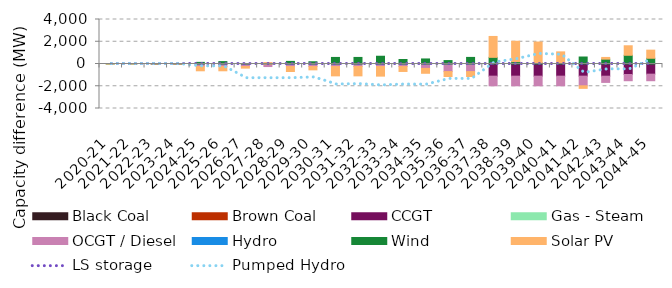
| Category | Black Coal | Brown Coal | CCGT | Gas - Steam | OCGT / Diesel | Hydro | Wind | Solar PV |
|---|---|---|---|---|---|---|---|---|
| 2020-21 | 0 | 0 | 0 | 0 | 0 | 0 | 0.007 | 0.002 |
| 2021-22 | 0 | 0 | 0 | 0 | 0 | 0 | 0.007 | 0.002 |
| 2022-23 | 0 | 0 | 0 | 0 | 0.001 | 0 | 0.007 | 0.002 |
| 2023-24 | 0 | 0 | 0 | 0 | -0.001 | 0 | 0.415 | 0.005 |
| 2024-25 | 0 | 0 | 0 | 0 | -229.379 | 0 | 146.374 | -381.403 |
| 2025-26 | 0 | 0 | 0 | 0 | -229.379 | 0 | 215.028 | -381.404 |
| 2026-27 | 0 | 0 | 0 | 0 | -229.379 | 0 | 1.312 | -141.807 |
| 2027-28 | 0 | 0 | 0 | 0 | -229.379 | 0 | 0.662 | 129.194 |
| 2028-29 | 0 | 0 | 0 | 0 | -229.379 | 0 | 234.174 | -443.969 |
| 2029-30 | 0 | 0 | 0.001 | 0 | -229.379 | 0 | 201.346 | -295.634 |
| 2030-31 | 0 | 0 | 0.001 | 0 | -229.379 | 0 | 590.132 | -837.068 |
| 2031-32 | 0 | 0 | 0.001 | 0 | -229.379 | 0 | 590.132 | -837.068 |
| 2032-33 | 0 | 0 | 0.001 | 0 | -229.379 | 0 | 697.127 | -861.067 |
| 2033-34 | 0 | 0 | 0.001 | 0 | -229.379 | 0 | 404.416 | -440.935 |
| 2034-35 | 0 | 0 | 0.001 | 0 | -393.222 | 0 | 453.953 | -440.935 |
| 2035-36 | 0 | 0 | 0 | 0 | -681.01 | 0 | 308.031 | -440.935 |
| 2036-37 | 0 | 0 | 0 | 0 | -681.009 | 0 | 592.05 | -440.935 |
| 2037-38 | 0 | 0 | -1093.22 | 0 | -865.794 | 0 | 598.242 | 1877.722 |
| 2038-39 | 0 | 0 | -1093.22 | 0 | -865.794 | 0 | 214.289 | 1829.207 |
| 2039-40 | 0 | 0 | -1093.22 | 0 | -865.794 | 0 | 103.336 | 1872.341 |
| 2040-41 | 0 | 0 | -1093.22 | 0 | -865.794 | 0 | 103.205 | 987.887 |
| 2041-42 | 0 | 0 | -1093.22 | 0 | -865.794 | 0 | 628.529 | -231.129 |
| 2042-43 | 0 | 0 | -1096.154 | 0 | -557.891 | 0 | 436.157 | 154.24 |
| 2043-44 | 0 | 0 | -945.155 | 0 | -557.89 | 0 | 783.103 | 855.527 |
| 2044-45 | 0 | 0 | -913.448 | 0 | -589.248 | 0 | 515.734 | 729.114 |